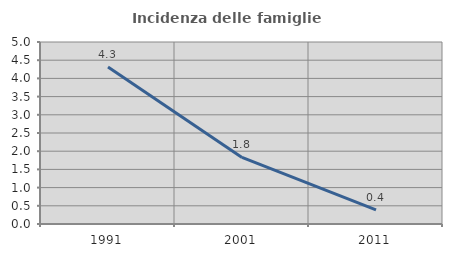
| Category | Incidenza delle famiglie numerose |
|---|---|
| 1991.0 | 4.31 |
| 2001.0 | 1.829 |
| 2011.0 | 0.388 |